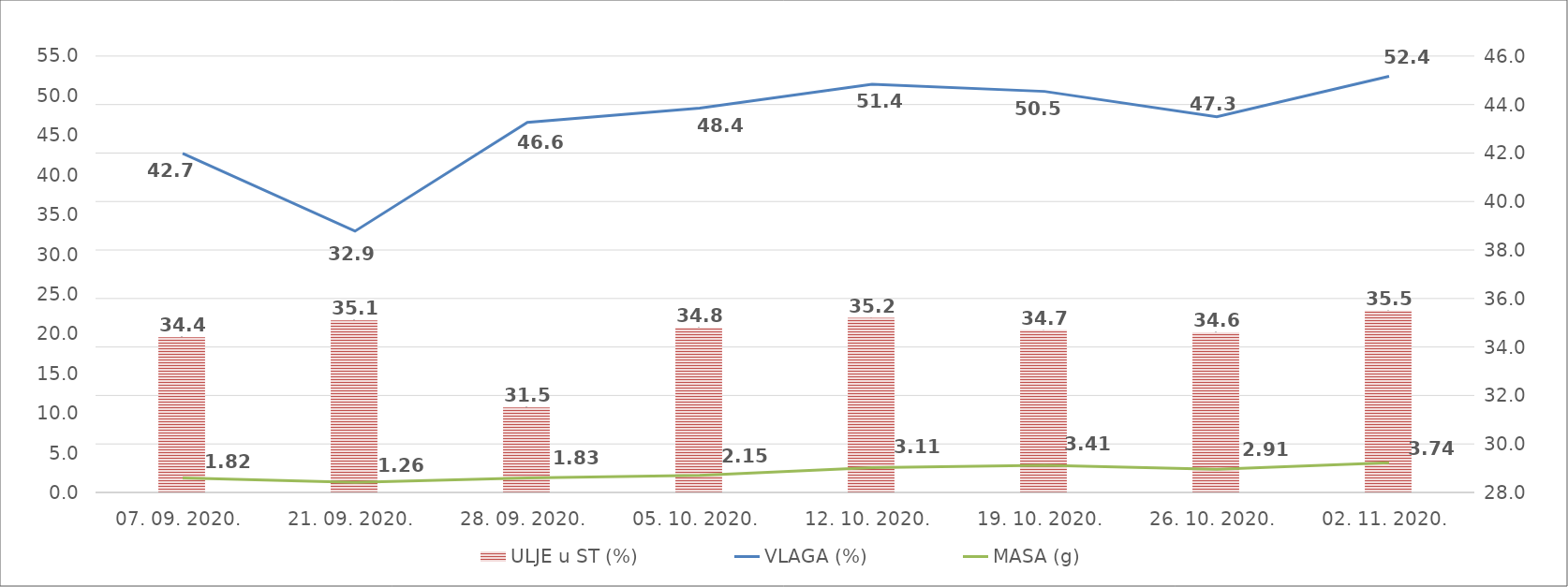
| Category | ULJE u ST (%) |
|---|---|
| 07. 09. 2020. | 34.4 |
| 21. 09. 2020. | 35.1 |
| 28. 09. 2020. | 31.5 |
| 05. 10. 2020. | 34.8 |
| 12. 10. 2020. | 35.2 |
| 19. 10. 2020. | 34.7 |
| 26. 10. 2020. | 34.6 |
| 02. 11. 2020. | 35.5 |